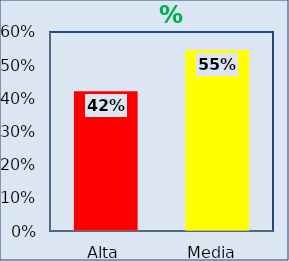
| Category | Series 0 |
|---|---|
| Alta | 0.421 |
| Media  | 0.545 |